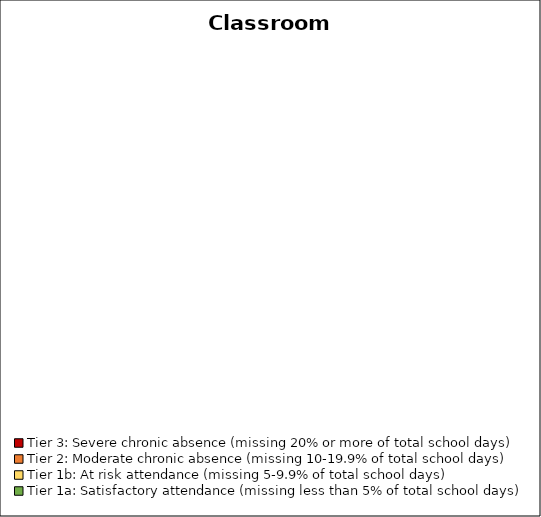
| Category | Series 0 |
|---|---|
| Tier 3: Severe chronic absence (missing 20% or more of total school days) | 0 |
| Tier 2: Moderate chronic absence (missing 10-19.9% of total school days) | 0 |
| Tier 1b: At risk attendance (missing 5-9.9% of total school days) | 0 |
| Tier 1a: Satisfactory attendance (missing less than 5% of total school days) | 0 |